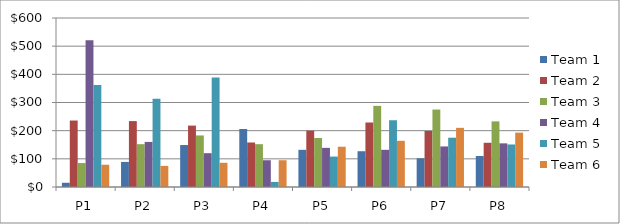
| Category | Team 1 | Team 2 | Team 3 | Team 4 | Team 5 | Team 6 |
|---|---|---|---|---|---|---|
| P1 | 15 | 236 | 85 | 521 | 362 | 79 |
| P2 | 89 | 234 | 152 | 160 | 313 | 75 |
| P3 | 149 | 218 | 183 | 120 | 389 | 86 |
| P4 | 206 | 158 | 152 | 95 | 18 | 95 |
| P5 | 132 | 200 | 174 | 139 | 108 | 143 |
| P6 | 127 | 229 | 288 | 132 | 237 | 164 |
| P7 | 102 | 199 | 275 | 144 | 175 | 210 |
| P8 | 110 | 157 | 233 | 155 | 151 | 193 |